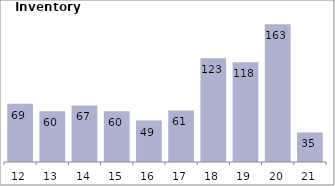
| Category | Series 0 |
|---|---|
| 2012-03-31 | 69 |
| 2013-03-31 | 60 |
| 2014-03-31 | 67 |
| 2015-03-31 | 60 |
| 2016-03-31 | 49 |
| 2017-03-31 | 61 |
| 2018-03-31 | 123 |
| 2019-03-31 | 118 |
| 2020-03-31 | 163 |
| 2021-03-31 | 35 |